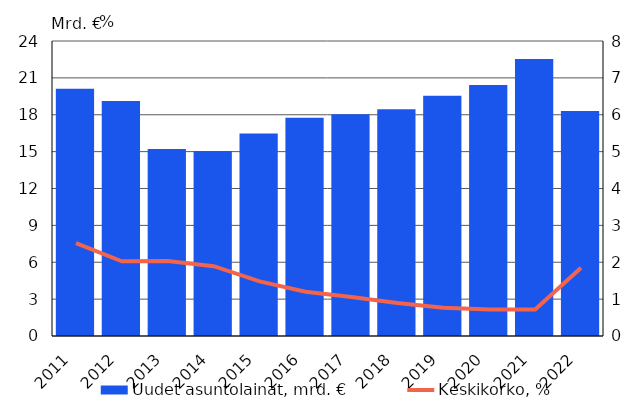
| Category | Uudet asuntolainat, mrd. € |
|---|---|
| 2011.0 | 20.124 |
| 2012.0 | 19.114 |
| 2013.0 | 15.22 |
| 2014.0 | 15.052 |
| 2015.0 | 16.482 |
| 2016.0 | 17.75 |
| 2017.0 | 18.04 |
| 2018.0 | 18.442 |
| 2019.0 | 19.547 |
| 2020.0 | 20.424 |
| 2021.0 | 22.533 |
| 2022.0 | 18.299 |